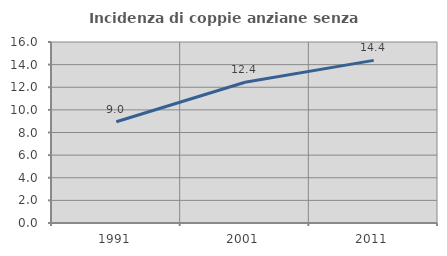
| Category | Incidenza di coppie anziane senza figli  |
|---|---|
| 1991.0 | 8.953 |
| 2001.0 | 12.44 |
| 2011.0 | 14.376 |